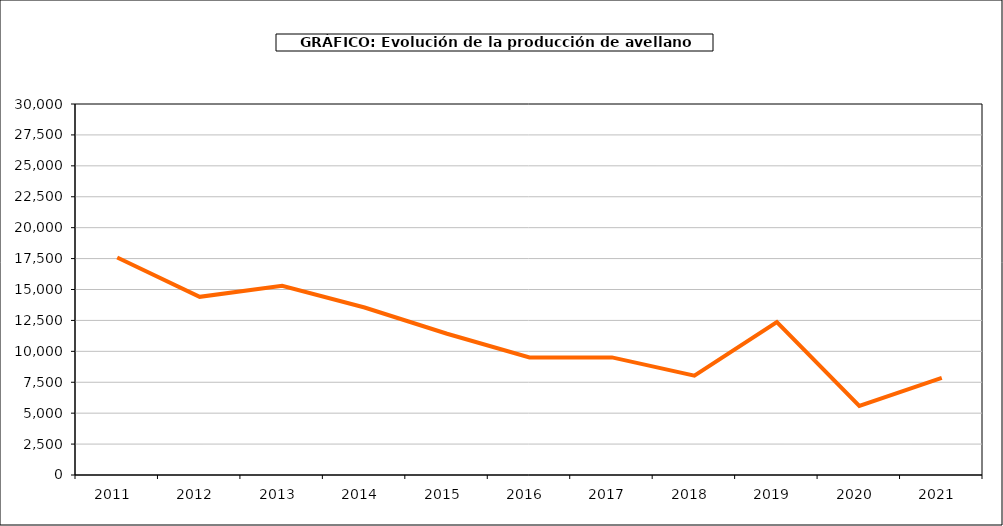
| Category | producción avellano |
|---|---|
| 2011.0 | 17590 |
| 2012.0 | 14406 |
| 2013.0 | 15302 |
| 2014.0 | 13544 |
| 2015.0 | 11423 |
| 2016.0 | 9510 |
| 2017.0 | 9510 |
| 2018.0 | 8033 |
| 2019.0 | 12371 |
| 2020.0 | 5587 |
| 2021.0 | 7854 |